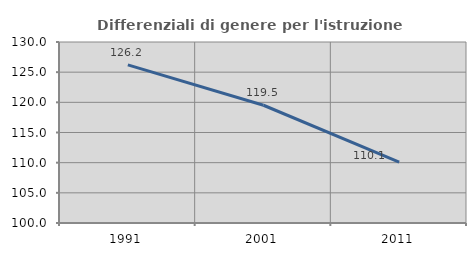
| Category | Differenziali di genere per l'istruzione superiore |
|---|---|
| 1991.0 | 126.212 |
| 2001.0 | 119.517 |
| 2011.0 | 110.081 |